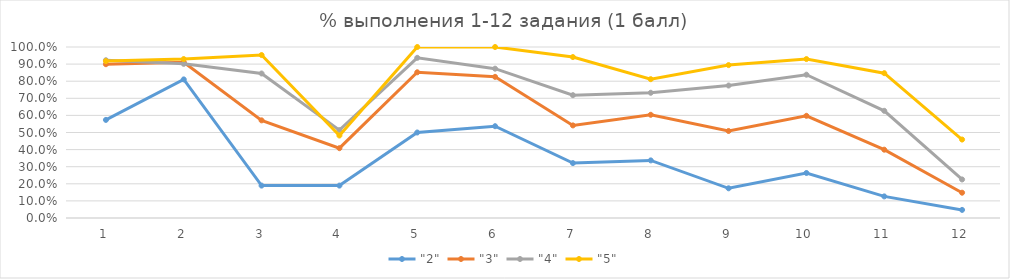
| Category | "2" | "3" | "4" | "5" |
|---|---|---|---|---|
| 0 | 0.574 | 0.899 | 0.923 | 0.918 |
| 1 | 0.811 | 0.911 | 0.901 | 0.929 |
| 2 | 0.189 | 0.571 | 0.845 | 0.953 |
| 3 | 0.189 | 0.408 | 0.514 | 0.482 |
| 4 | 0.5 | 0.852 | 0.937 | 1 |
| 5 | 0.537 | 0.825 | 0.873 | 1 |
| 6 | 0.321 | 0.541 | 0.718 | 0.941 |
| 7 | 0.337 | 0.604 | 0.732 | 0.812 |
| 8 | 0.174 | 0.509 | 0.775 | 0.894 |
| 9 | 0.263 | 0.598 | 0.838 | 0.929 |
| 10 | 0.126 | 0.399 | 0.627 | 0.847 |
| 11 | 0.047 | 0.148 | 0.225 | 0.459 |